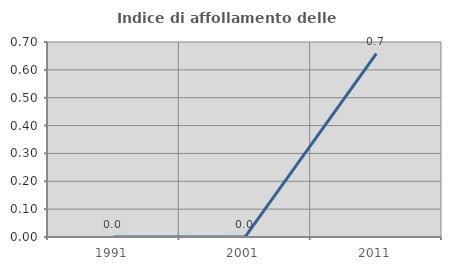
| Category | Indice di affollamento delle abitazioni  |
|---|---|
| 1991.0 | 0 |
| 2001.0 | 0 |
| 2011.0 | 0.658 |